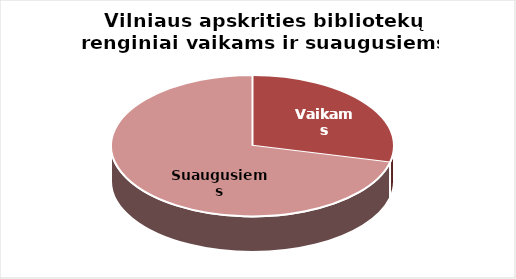
| Category | Series 0 |
|---|---|
| Vaikams | 2764 |
| Suaugusiems | 6838 |